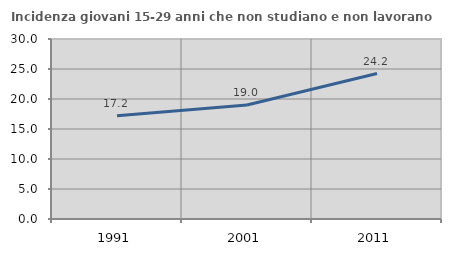
| Category | Incidenza giovani 15-29 anni che non studiano e non lavorano  |
|---|---|
| 1991.0 | 17.218 |
| 2001.0 | 18.987 |
| 2011.0 | 24.242 |